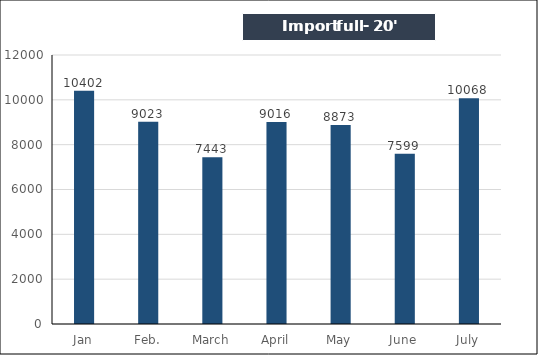
| Category | Import full - 20' |
|---|---|
| Jan | 10402 |
| Feb. | 9023 |
| March | 7443 |
| April | 9016 |
| May | 8873 |
| June | 7599 |
| July | 10068 |